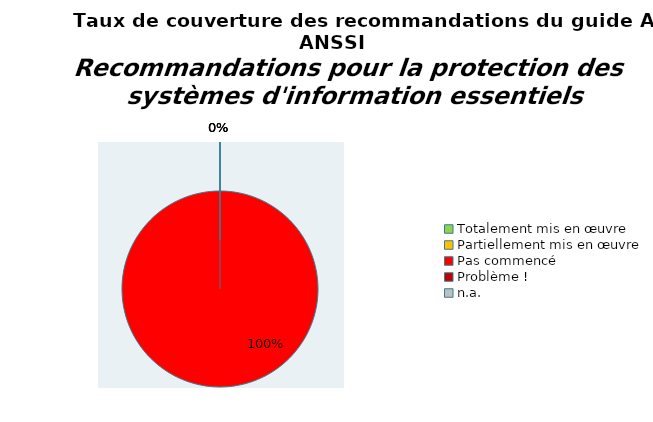
| Category | Series 0 |
|---|---|
| Totalement mis en œuvre | 0 |
| Partiellement mis en œuvre | 0 |
| Pas commencé | 79 |
| Problème ! | 0 |
| n.a. | 0 |